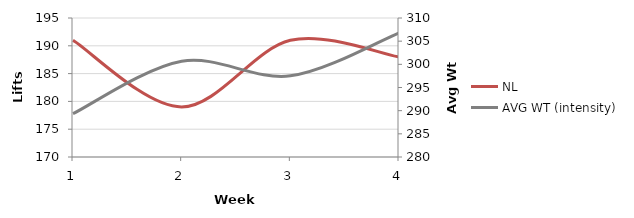
| Category | NL |
|---|---|
| 0 | 191 |
| 1 | 179 |
| 2 | 191 |
| 3 | 188 |